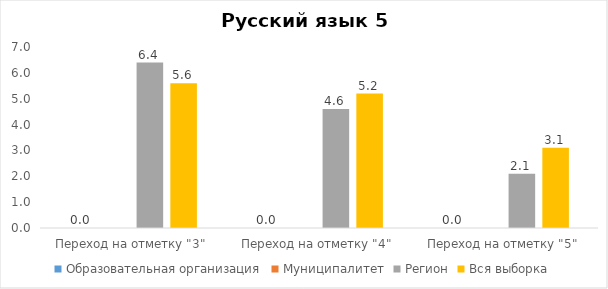
| Category | Образовательная организация | Муниципалитет | Регион | Вся выборка |
|---|---|---|---|---|
| Переход на отметку "3" | 0 |  | 6.4 | 5.6 |
| Переход на отметку "4" | 0 |  | 4.6 | 5.2 |
| Переход на отметку "5" | 0 |  | 2.1 | 3.1 |